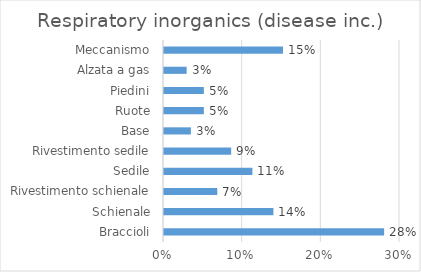
| Category | Respiratory inorganics (disease inc.) |
|---|---|
| Braccioli | 0.28 |
| Schienale | 0.139 |
| Rivestimento schienale | 0.068 |
| Sedile | 0.112 |
| Rivestimento sedile | 0.085 |
| Base | 0.034 |
| Ruote | 0.051 |
| Piedini | 0.051 |
| Alzata a gas | 0.029 |
| Meccanismo | 0.151 |